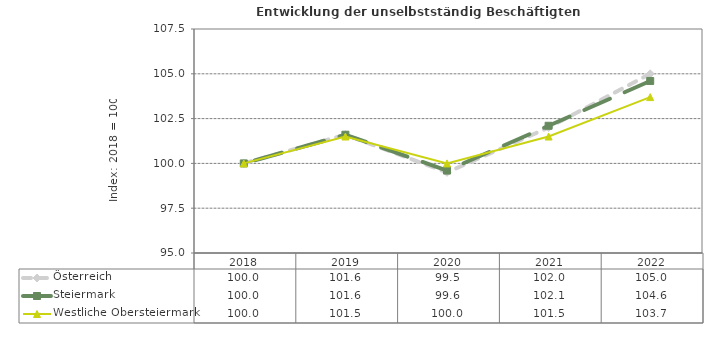
| Category | Österreich | Steiermark | Westliche Obersteiermark |
|---|---|---|---|
| 2022.0 | 105 | 104.6 | 103.7 |
| 2021.0 | 102 | 102.1 | 101.5 |
| 2020.0 | 99.5 | 99.6 | 100 |
| 2019.0 | 101.6 | 101.6 | 101.5 |
| 2018.0 | 100 | 100 | 100 |